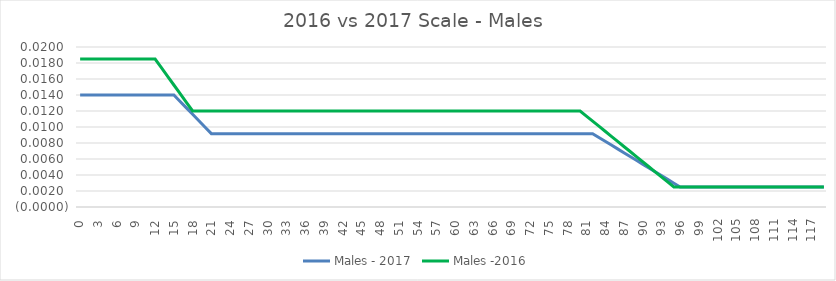
| Category | Males - 2017 | Males -2016 |
|---|---|---|
| 0.0 | 0.014 | 0.018 |
| 1.0 | 0.014 | 0.018 |
| 2.0 | 0.014 | 0.018 |
| 3.0 | 0.014 | 0.018 |
| 4.0 | 0.014 | 0.018 |
| 5.0 | 0.014 | 0.018 |
| 6.0 | 0.014 | 0.018 |
| 7.0 | 0.014 | 0.018 |
| 8.0 | 0.014 | 0.018 |
| 9.0 | 0.014 | 0.018 |
| 10.0 | 0.014 | 0.018 |
| 11.0 | 0.014 | 0.018 |
| 12.0 | 0.014 | 0.018 |
| 13.0 | 0.014 | 0.017 |
| 14.0 | 0.014 | 0.016 |
| 15.0 | 0.014 | 0.015 |
| 16.0 | 0.013 | 0.014 |
| 17.0 | 0.012 | 0.013 |
| 18.0 | 0.012 | 0.012 |
| 19.0 | 0.011 | 0.012 |
| 20.0 | 0.01 | 0.012 |
| 21.0 | 0.009 | 0.012 |
| 22.0 | 0.009 | 0.012 |
| 23.0 | 0.009 | 0.012 |
| 24.0 | 0.009 | 0.012 |
| 25.0 | 0.009 | 0.012 |
| 26.0 | 0.009 | 0.012 |
| 27.0 | 0.009 | 0.012 |
| 28.0 | 0.009 | 0.012 |
| 29.0 | 0.009 | 0.012 |
| 30.0 | 0.009 | 0.012 |
| 31.0 | 0.009 | 0.012 |
| 32.0 | 0.009 | 0.012 |
| 33.0 | 0.009 | 0.012 |
| 34.0 | 0.009 | 0.012 |
| 35.0 | 0.009 | 0.012 |
| 36.0 | 0.009 | 0.012 |
| 37.0 | 0.009 | 0.012 |
| 38.0 | 0.009 | 0.012 |
| 39.0 | 0.009 | 0.012 |
| 40.0 | 0.009 | 0.012 |
| 41.0 | 0.009 | 0.012 |
| 42.0 | 0.009 | 0.012 |
| 43.0 | 0.009 | 0.012 |
| 44.0 | 0.009 | 0.012 |
| 45.0 | 0.009 | 0.012 |
| 46.0 | 0.009 | 0.012 |
| 47.0 | 0.009 | 0.012 |
| 48.0 | 0.009 | 0.012 |
| 49.0 | 0.009 | 0.012 |
| 50.0 | 0.009 | 0.012 |
| 51.0 | 0.009 | 0.012 |
| 52.0 | 0.009 | 0.012 |
| 53.0 | 0.009 | 0.012 |
| 54.0 | 0.009 | 0.012 |
| 55.0 | 0.009 | 0.012 |
| 56.0 | 0.009 | 0.012 |
| 57.0 | 0.009 | 0.012 |
| 58.0 | 0.009 | 0.012 |
| 59.0 | 0.009 | 0.012 |
| 60.0 | 0.009 | 0.012 |
| 61.0 | 0.009 | 0.012 |
| 62.0 | 0.009 | 0.012 |
| 63.0 | 0.009 | 0.012 |
| 64.0 | 0.009 | 0.012 |
| 65.0 | 0.009 | 0.012 |
| 66.0 | 0.009 | 0.012 |
| 67.0 | 0.009 | 0.012 |
| 68.0 | 0.009 | 0.012 |
| 69.0 | 0.009 | 0.012 |
| 70.0 | 0.009 | 0.012 |
| 71.0 | 0.009 | 0.012 |
| 72.0 | 0.009 | 0.012 |
| 73.0 | 0.009 | 0.012 |
| 74.0 | 0.009 | 0.012 |
| 75.0 | 0.009 | 0.012 |
| 76.0 | 0.009 | 0.012 |
| 77.0 | 0.009 | 0.012 |
| 78.0 | 0.009 | 0.012 |
| 79.0 | 0.009 | 0.012 |
| 80.0 | 0.009 | 0.012 |
| 81.0 | 0.009 | 0.011 |
| 82.0 | 0.009 | 0.011 |
| 83.0 | 0.009 | 0.01 |
| 84.0 | 0.008 | 0.009 |
| 85.0 | 0.008 | 0.009 |
| 86.0 | 0.007 | 0.008 |
| 87.0 | 0.007 | 0.008 |
| 88.0 | 0.006 | 0.007 |
| 89.0 | 0.006 | 0.006 |
| 90.0 | 0.005 | 0.006 |
| 91.0 | 0.005 | 0.005 |
| 92.0 | 0.004 | 0.004 |
| 93.0 | 0.004 | 0.004 |
| 94.0 | 0.003 | 0.003 |
| 95.0 | 0.003 | 0.002 |
| 96.0 | 0.002 | 0.002 |
| 97.0 | 0.002 | 0.002 |
| 98.0 | 0.002 | 0.002 |
| 99.0 | 0.002 | 0.002 |
| 100.0 | 0.002 | 0.002 |
| 101.0 | 0.002 | 0.002 |
| 102.0 | 0.002 | 0.002 |
| 103.0 | 0.002 | 0.002 |
| 104.0 | 0.002 | 0.002 |
| 105.0 | 0.002 | 0.002 |
| 106.0 | 0.002 | 0.002 |
| 107.0 | 0.002 | 0.002 |
| 108.0 | 0.002 | 0.002 |
| 109.0 | 0.002 | 0.002 |
| 110.0 | 0.002 | 0.002 |
| 111.0 | 0.002 | 0.002 |
| 112.0 | 0.002 | 0.002 |
| 113.0 | 0.002 | 0.002 |
| 114.0 | 0.002 | 0.002 |
| 115.0 | 0.002 | 0.002 |
| 116.0 | 0.002 | 0.002 |
| 117.0 | 0.002 | 0.002 |
| 118.0 | 0.002 | 0.002 |
| 119.0 | 0.002 | 0.002 |